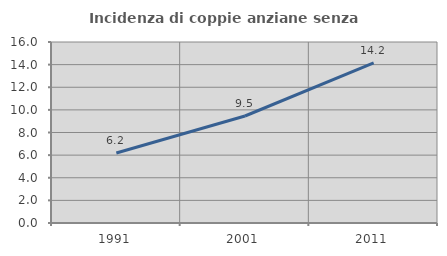
| Category | Incidenza di coppie anziane senza figli  |
|---|---|
| 1991.0 | 6.183 |
| 2001.0 | 9.458 |
| 2011.0 | 14.152 |